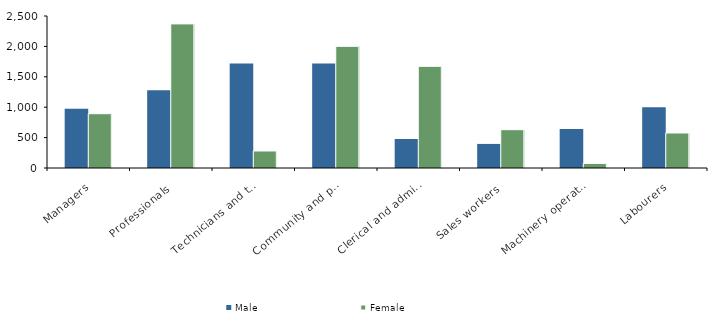
| Category | Male | Female |
|---|---|---|
| Managers | 973 | 893 |
| Professionals | 1279 | 2370 |
| Technicians and trades workers | 1718 | 280 |
| Community and personal service workers | 1719 | 2001 |
| Clerical and administrative workers | 477 | 1672 |
| Sales workers | 396 | 630 |
| Machinery operators and drivers | 643 | 75 |
| Labourers | 1001 | 576 |